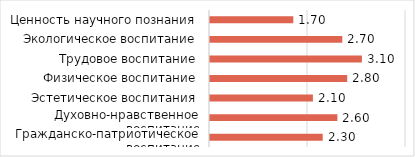
| Category | Средний
 балл |
|---|---|
| Гражданско-патриотическое воспитание | 2.3 |
| Духовно-нравственное воспитание | 2.6 |
| Эстетическое воспитания | 2.1 |
| Физическое воспитание | 2.8 |
| Трудовое воспитание | 3.1 |
| Экологическое воспитание | 2.7 |
| Ценность научного познания | 1.7 |